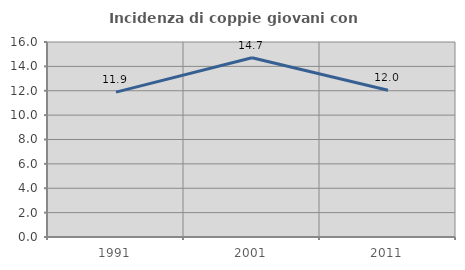
| Category | Incidenza di coppie giovani con figli |
|---|---|
| 1991.0 | 11.885 |
| 2001.0 | 14.706 |
| 2011.0 | 12.04 |